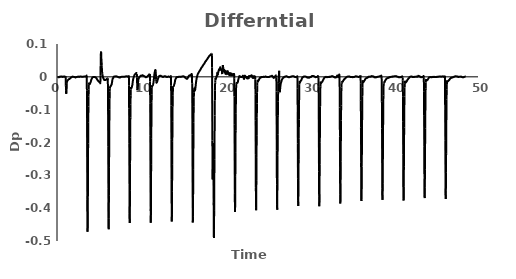
| Category | Series 0 |
|---|---|
| 0.083333 | 0 |
| 0.1 | 0 |
| 0.116667 | 0 |
| 0.133333 | -0.001 |
| 0.15 | -0.001 |
| 0.166667 | -0.001 |
| 0.183333 | -0.001 |
| 0.2 | -0.001 |
| 0.216667 | -0.001 |
| 0.233333 | -0.002 |
| 0.25 | -0.001 |
| 0.266667 | -0.001 |
| 0.283333 | -0.001 |
| 0.3 | 0 |
| 0.316667 | 0 |
| 0.333333 | 0 |
| 0.35 | 0.001 |
| 0.366667 | 0.001 |
| 0.383333 | 0.001 |
| 0.4 | 0.001 |
| 0.416667 | 0.001 |
| 0.433333 | 0 |
| 0.45 | 0 |
| 0.466667 | 0 |
| 0.483333 | 0 |
| 0.5 | 0 |
| 0.516667 | 0.001 |
| 0.533333 | 0.001 |
| 0.55 | 0.001 |
| 0.566667 | 0.001 |
| 0.583333 | 0.001 |
| 0.6 | 0.001 |
| 0.616667 | 0.001 |
| 0.633333 | 0 |
| 0.65 | 0 |
| 0.666667 | 0 |
| 0.683333 | 0 |
| 0.7 | 0 |
| 0.716667 | 0 |
| 0.733333 | 0 |
| 0.75 | 0 |
| 0.766667 | 0 |
| 0.783333 | 0.001 |
| 0.8 | 0.001 |
| 0.816667 | 0.001 |
| 0.833333 | 0 |
| 0.85 | 0 |
| 0.866667 | 0 |
| 0.883333 | 0 |
| 0.9 | 0 |
| 0.916667 | 0.001 |
| 0.933333 | 0.001 |
| 0.95 | 0 |
| 0.966667 | 0 |
| 0.983333 | 0 |
| 1.0 | 0 |
| 1.016667 | 0.002 |
| 1.033333 | -0.001 |
| 1.05 | -0.025 |
| 1.066667 | -0.041 |
| 1.083333 | -0.049 |
| 1.1 | -0.052 |
| 1.116667 | -0.049 |
| 1.133333 | -0.042 |
| 1.15 | -0.032 |
| 1.166667 | -0.021 |
| 1.183333 | -0.017 |
| 1.2 | -0.015 |
| 1.216667 | -0.013 |
| 1.233333 | -0.011 |
| 1.25 | -0.011 |
| 1.266667 | -0.011 |
| 1.283333 | -0.01 |
| 1.3 | -0.01 |
| 1.316667 | -0.009 |
| 1.333333 | -0.009 |
| 1.35 | -0.009 |
| 1.366667 | -0.008 |
| 1.383333 | -0.008 |
| 1.4 | -0.007 |
| 1.416667 | -0.007 |
| 1.433333 | -0.007 |
| 1.45 | -0.007 |
| 1.466667 | -0.007 |
| 1.483333 | -0.006 |
| 1.5 | -0.006 |
| 1.516667 | -0.006 |
| 1.533333 | -0.005 |
| 1.55 | -0.005 |
| 1.566667 | -0.004 |
| 1.583333 | -0.004 |
| 1.6 | -0.004 |
| 1.616667 | -0.003 |
| 1.633333 | -0.003 |
| 1.65 | -0.003 |
| 1.666667 | -0.002 |
| 1.683333 | -0.002 |
| 1.7 | -0.002 |
| 1.716667 | -0.001 |
| 1.733333 | -0.001 |
| 1.75 | -0.001 |
| 1.766667 | -0.001 |
| 1.783333 | -0.001 |
| 1.8 | 0 |
| 1.816667 | 0 |
| 1.833333 | 0 |
| 1.85 | 0.001 |
| 1.866667 | 0.001 |
| 1.883333 | 0.001 |
| 1.9 | 0.001 |
| 1.916667 | 0 |
| 1.933333 | 0 |
| 1.95 | 0 |
| 1.966667 | 0 |
| 1.983333 | 0 |
| 2.0 | 0 |
| 2.016667 | -0.001 |
| 2.033333 | -0.001 |
| 2.05 | -0.001 |
| 2.066667 | -0.001 |
| 2.083333 | -0.001 |
| 2.1 | -0.001 |
| 2.116667 | -0.001 |
| 2.133333 | -0.001 |
| 2.15 | -0.002 |
| 2.166667 | -0.002 |
| 2.183333 | -0.002 |
| 2.2 | -0.002 |
| 2.216667 | -0.002 |
| 2.233333 | -0.001 |
| 2.25 | -0.001 |
| 2.266667 | -0.001 |
| 2.283333 | -0.001 |
| 2.3 | -0.001 |
| 2.316667 | -0.001 |
| 2.333333 | 0 |
| 2.35 | 0 |
| 2.366667 | 0 |
| 2.383333 | 0 |
| 2.4 | 0 |
| 2.416667 | 0 |
| 2.433333 | 0 |
| 2.45 | 0 |
| 2.466667 | 0 |
| 2.483333 | 0.001 |
| 2.5 | 0.001 |
| 2.516667 | 0.001 |
| 2.533333 | 0 |
| 2.55 | 0 |
| 2.566667 | 0 |
| 2.583333 | 0 |
| 2.6 | 0 |
| 2.616667 | 0 |
| 2.633333 | 0 |
| 2.65 | 0 |
| 2.666667 | 0 |
| 2.683333 | 0 |
| 2.7 | 0 |
| 2.716667 | 0.001 |
| 2.733333 | 0.001 |
| 2.75 | 0.001 |
| 2.766667 | 0.001 |
| 2.783333 | 0.001 |
| 2.8 | 0.001 |
| 2.816667 | 0.001 |
| 2.833333 | 0.001 |
| 2.85 | 0.001 |
| 2.866667 | 0.001 |
| 2.883333 | 0.001 |
| 2.9 | 0 |
| 2.916667 | 0 |
| 2.933333 | 0.001 |
| 2.95 | 0 |
| 2.966667 | 0 |
| 2.983333 | 0.001 |
| 3.0 | 0.001 |
| 3.016667 | 0.001 |
| 3.033333 | 0 |
| 3.05 | 0 |
| 3.066667 | 0 |
| 3.083333 | 0 |
| 3.1 | 0 |
| 3.116667 | 0 |
| 3.133333 | 0 |
| 3.15 | 0.001 |
| 3.166667 | 0.001 |
| 3.183333 | 0.001 |
| 3.2 | 0.001 |
| 3.216667 | 0.001 |
| 3.233333 | 0.001 |
| 3.25 | 0.001 |
| 3.266667 | 0.001 |
| 3.283333 | 0.001 |
| 3.3 | 0.001 |
| 3.316667 | 0.001 |
| 3.333333 | 0.001 |
| 3.35 | 0.001 |
| 3.366667 | 0.001 |
| 3.383333 | 0.001 |
| 3.4 | 0.001 |
| 3.416667 | 0.001 |
| 3.433333 | 0.001 |
| 3.45 | 0.001 |
| 3.466667 | 0.001 |
| 3.483333 | 0 |
| 3.5 | 0.001 |
| 3.516667 | 0.004 |
| 3.533333 | 0.003 |
| 3.55 | -0.041 |
| 3.566667 | -0.126 |
| 3.583333 | -0.244 |
| 3.6 | -0.373 |
| 3.616667 | -0.451 |
| 3.633333 | -0.472 |
| 3.65 | -0.433 |
| 3.666667 | -0.366 |
| 3.683333 | -0.283 |
| 3.7 | -0.203 |
| 3.716667 | -0.138 |
| 3.733333 | -0.09 |
| 3.75 | -0.061 |
| 3.766667 | -0.039 |
| 3.783333 | -0.024 |
| 3.8 | -0.018 |
| 3.816667 | -0.018 |
| 3.833333 | -0.02 |
| 3.85 | -0.021 |
| 3.866667 | -0.022 |
| 3.883333 | -0.022 |
| 3.9 | -0.022 |
| 3.916667 | -0.021 |
| 3.933333 | -0.02 |
| 3.95 | -0.019 |
| 3.966667 | -0.018 |
| 3.983333 | -0.017 |
| 4.0 | -0.016 |
| 4.016667 | -0.015 |
| 4.033333 | -0.013 |
| 4.05 | -0.011 |
| 4.066667 | -0.009 |
| 4.083333 | -0.008 |
| 4.1 | -0.007 |
| 4.116667 | -0.007 |
| 4.133333 | -0.006 |
| 4.15 | -0.005 |
| 4.166667 | -0.004 |
| 4.183333 | -0.003 |
| 4.2 | -0.003 |
| 4.216667 | -0.002 |
| 4.233333 | -0.002 |
| 4.25 | -0.001 |
| 4.266667 | -0.001 |
| 4.283333 | -0.001 |
| 4.3 | -0.001 |
| 4.316667 | -0.001 |
| 4.333333 | -0.001 |
| 4.35 | -0.001 |
| 4.366667 | -0.001 |
| 4.383333 | -0.001 |
| 4.4 | 0 |
| 4.416667 | 0 |
| 4.433333 | 0 |
| 4.45 | 0 |
| 4.466667 | 0 |
| 4.483333 | 0 |
| 4.5 | -0.001 |
| 4.516667 | -0.001 |
| 4.533333 | -0.001 |
| 4.55 | -0.001 |
| 4.566667 | -0.002 |
| 4.583333 | -0.002 |
| 4.6 | -0.002 |
| 4.616667 | -0.002 |
| 4.633333 | -0.003 |
| 4.65 | -0.003 |
| 4.666667 | -0.004 |
| 4.683333 | -0.004 |
| 4.7 | -0.005 |
| 4.716667 | -0.006 |
| 4.733333 | -0.006 |
| 4.75 | -0.007 |
| 4.766667 | -0.008 |
| 4.783333 | -0.009 |
| 4.8 | -0.01 |
| 4.816667 | -0.01 |
| 4.833333 | -0.01 |
| 4.85 | -0.011 |
| 4.866667 | -0.011 |
| 4.883333 | -0.012 |
| 4.9 | -0.012 |
| 4.916667 | -0.013 |
| 4.933333 | -0.013 |
| 4.95 | -0.014 |
| 4.966667 | -0.014 |
| 4.983333 | -0.015 |
| 5.0 | -0.015 |
| 5.016667 | -0.016 |
| 5.033333 | -0.016 |
| 5.05 | -0.016 |
| 5.066667 | -0.016 |
| 5.083333 | -0.016 |
| 5.1 | -0.017 |
| 5.116667 | -0.018 |
| 5.133333 | -0.02 |
| 5.15 | -0.017 |
| 5.166667 | 0.005 |
| 5.183333 | 0.035 |
| 5.2 | 0.061 |
| 5.216667 | 0.076 |
| 5.233333 | 0.077 |
| 5.25 | 0.074 |
| 5.266667 | 0.058 |
| 5.283333 | 0.046 |
| 5.3 | 0.044 |
| 5.316667 | 0.034 |
| 5.333333 | 0.025 |
| 5.35 | 0.019 |
| 5.366667 | 0.011 |
| 5.383333 | 0.008 |
| 5.4 | 0.006 |
| 5.416667 | 0.004 |
| 5.433333 | 0.002 |
| 5.45 | 0 |
| 5.466667 | -0.001 |
| 5.483333 | -0.002 |
| 5.5 | -0.004 |
| 5.516667 | -0.005 |
| 5.533333 | -0.006 |
| 5.55 | -0.006 |
| 5.566667 | -0.007 |
| 5.583333 | -0.008 |
| 5.6 | -0.009 |
| 5.616667 | -0.01 |
| 5.633333 | -0.01 |
| 5.65 | -0.01 |
| 5.666667 | -0.01 |
| 5.683333 | -0.01 |
| 5.7 | -0.009 |
| 5.716667 | -0.009 |
| 5.733333 | -0.009 |
| 5.75 | -0.009 |
| 5.766667 | -0.009 |
| 5.783333 | -0.009 |
| 5.8 | -0.009 |
| 5.816667 | -0.009 |
| 5.833333 | -0.008 |
| 5.85 | -0.008 |
| 5.866667 | -0.008 |
| 5.883333 | -0.007 |
| 5.9 | -0.007 |
| 5.916667 | -0.007 |
| 5.933333 | -0.007 |
| 5.95 | -0.006 |
| 5.966667 | -0.005 |
| 5.983333 | -0.005 |
| 6.0 | -0.005 |
| 6.016667 | -0.007 |
| 6.033333 | -0.005 |
| 6.05 | -0.034 |
| 6.066667 | -0.104 |
| 6.083333 | -0.212 |
| 6.1 | -0.339 |
| 6.116667 | -0.431 |
| 6.133333 | -0.464 |
| 6.15 | -0.431 |
| 6.166667 | -0.361 |
| 6.183333 | -0.277 |
| 6.2 | -0.208 |
| 6.216667 | -0.144 |
| 6.233333 | -0.098 |
| 6.25 | -0.067 |
| 6.266667 | -0.044 |
| 6.283333 | -0.036 |
| 6.3 | -0.032 |
| 6.316667 | -0.03 |
| 6.333333 | -0.029 |
| 6.35 | -0.029 |
| 6.366667 | -0.029 |
| 6.383333 | -0.029 |
| 6.4 | -0.028 |
| 6.416667 | -0.026 |
| 6.433333 | -0.025 |
| 6.45 | -0.025 |
| 6.466667 | -0.024 |
| 6.483333 | -0.024 |
| 6.5 | -0.022 |
| 6.516667 | -0.019 |
| 6.533333 | -0.016 |
| 6.55 | -0.014 |
| 6.566667 | -0.011 |
| 6.583333 | -0.009 |
| 6.6 | -0.007 |
| 6.616667 | -0.006 |
| 6.633333 | -0.005 |
| 6.65 | -0.004 |
| 6.666667 | -0.004 |
| 6.683333 | -0.003 |
| 6.7 | -0.002 |
| 6.716667 | -0.001 |
| 6.733333 | 0 |
| 6.75 | 0 |
| 6.766667 | 0.001 |
| 6.783333 | 0.001 |
| 6.8 | 0.001 |
| 6.816667 | 0.001 |
| 6.833333 | 0.001 |
| 6.85 | 0.001 |
| 6.866667 | 0.001 |
| 6.883333 | 0.001 |
| 6.9 | 0.001 |
| 6.916667 | 0.001 |
| 6.933333 | 0.001 |
| 6.95 | 0.001 |
| 6.966667 | 0.001 |
| 6.983333 | 0.002 |
| 7.0 | 0.002 |
| 7.016667 | 0.002 |
| 7.033333 | 0.002 |
| 7.05 | 0.001 |
| 7.066667 | 0.001 |
| 7.083333 | 0.001 |
| 7.1 | 0.001 |
| 7.116667 | 0.001 |
| 7.133333 | 0.001 |
| 7.15 | 0.001 |
| 7.166667 | 0 |
| 7.183333 | 0 |
| 7.2 | 0 |
| 7.216667 | 0 |
| 7.233333 | 0 |
| 7.25 | -0.001 |
| 7.266667 | -0.001 |
| 7.283333 | -0.001 |
| 7.3 | -0.001 |
| 7.316667 | -0.001 |
| 7.333333 | -0.001 |
| 7.35 | -0.001 |
| 7.366667 | -0.002 |
| 7.383333 | -0.002 |
| 7.4 | -0.002 |
| 7.416667 | -0.002 |
| 7.433333 | -0.002 |
| 7.45 | -0.002 |
| 7.466667 | -0.002 |
| 7.483333 | -0.002 |
| 7.5 | -0.001 |
| 7.516667 | -0.001 |
| 7.533333 | -0.001 |
| 7.55 | -0.001 |
| 7.566667 | -0.001 |
| 7.583333 | 0 |
| 7.6 | 0 |
| 7.616667 | 0 |
| 7.633333 | 0 |
| 7.65 | 0 |
| 7.666667 | 0 |
| 7.683333 | 0 |
| 7.7 | 0 |
| 7.716667 | 0.001 |
| 7.733333 | 0.001 |
| 7.75 | 0 |
| 7.766667 | 0.001 |
| 7.783333 | 0.001 |
| 7.8 | 0.001 |
| 7.816667 | 0 |
| 7.833333 | 0 |
| 7.85 | 0 |
| 7.866667 | 0 |
| 7.883333 | 0 |
| 7.9 | 0 |
| 7.916667 | 0 |
| 7.933333 | 0 |
| 7.95 | 0 |
| 7.966667 | 0 |
| 7.983333 | 0 |
| 8.0 | 0 |
| 8.016667 | 0 |
| 8.033333 | 0 |
| 8.05 | 0 |
| 8.066667 | 0 |
| 8.083333 | 0.001 |
| 8.1 | 0.001 |
| 8.116667 | 0.001 |
| 8.133333 | 0.001 |
| 8.15 | 0.001 |
| 8.166667 | 0.001 |
| 8.183333 | 0.001 |
| 8.2 | 0.001 |
| 8.216667 | 0.001 |
| 8.233333 | 0.002 |
| 8.25 | 0.001 |
| 8.266667 | 0.001 |
| 8.283333 | 0.001 |
| 8.3 | 0.001 |
| 8.316667 | 0.001 |
| 8.333333 | 0.001 |
| 8.35 | 0.001 |
| 8.366667 | 0.001 |
| 8.383333 | 0.001 |
| 8.4 | 0.001 |
| 8.416667 | 0 |
| 8.433333 | 0 |
| 8.45 | 0 |
| 8.466667 | 0 |
| 8.483333 | 0 |
| 8.5 | 0.002 |
| 8.516667 | 0.003 |
| 8.533333 | 0.004 |
| 8.55 | -0.026 |
| 8.566667 | -0.096 |
| 8.583333 | -0.203 |
| 8.6 | -0.327 |
| 8.616667 | -0.416 |
| 8.633333 | -0.445 |
| 8.65 | -0.417 |
| 8.666667 | -0.347 |
| 8.683333 | -0.263 |
| 8.7 | -0.185 |
| 8.716667 | -0.124 |
| 8.733333 | -0.085 |
| 8.75 | -0.056 |
| 8.766667 | -0.039 |
| 8.783333 | -0.031 |
| 8.8 | -0.031 |
| 8.816667 | -0.032 |
| 8.833333 | -0.034 |
| 8.85 | -0.034 |
| 8.866667 | -0.033 |
| 8.883333 | -0.032 |
| 8.9 | -0.03 |
| 8.916667 | -0.027 |
| 8.933333 | -0.026 |
| 8.95 | -0.025 |
| 8.966667 | -0.022 |
| 8.983333 | -0.018 |
| 9.0 | -0.014 |
| 9.016667 | -0.011 |
| 9.033333 | -0.009 |
| 9.05 | -0.007 |
| 9.066667 | -0.005 |
| 9.083333 | -0.004 |
| 9.1 | -0.002 |
| 9.116667 | 0 |
| 9.133333 | 0.001 |
| 9.15 | 0.002 |
| 9.166667 | 0.003 |
| 9.183333 | 0.004 |
| 9.2 | 0.005 |
| 9.216667 | 0.006 |
| 9.233333 | 0.007 |
| 9.25 | 0.008 |
| 9.266667 | 0.008 |
| 9.283333 | 0.009 |
| 9.3 | 0.009 |
| 9.316667 | 0.009 |
| 9.333333 | 0.009 |
| 9.35 | 0.009 |
| 9.366667 | 0.01 |
| 9.383333 | 0.011 |
| 9.4 | 0.011 |
| 9.416667 | 0.012 |
| 9.433333 | 0.012 |
| 9.45 | 0.011 |
| 9.466667 | 0.01 |
| 9.483333 | 0.009 |
| 9.5 | -0.002 |
| 9.516667 | -0.02 |
| 9.533333 | -0.034 |
| 9.55 | -0.041 |
| 9.566667 | -0.039 |
| 9.583333 | -0.035 |
| 9.6 | -0.032 |
| 9.616667 | -0.025 |
| 9.633333 | -0.017 |
| 9.65 | -0.012 |
| 9.666667 | -0.008 |
| 9.683333 | -0.006 |
| 9.7 | -0.006 |
| 9.716667 | -0.005 |
| 9.733333 | -0.003 |
| 9.75 | -0.002 |
| 9.766667 | -0.002 |
| 9.783333 | -0.001 |
| 9.8 | 0 |
| 9.816667 | 0 |
| 9.833333 | 0.001 |
| 9.85 | 0.001 |
| 9.866667 | 0.001 |
| 9.883333 | 0.002 |
| 9.9 | 0.002 |
| 9.916667 | 0.002 |
| 9.933333 | 0.003 |
| 9.95 | 0.003 |
| 9.966667 | 0.004 |
| 9.983333 | 0.004 |
| 10.0 | 0.004 |
| 10.016667 | 0.004 |
| 10.033333 | 0.003 |
| 10.05 | 0.003 |
| 10.066667 | 0.003 |
| 10.083333 | 0.004 |
| 10.1 | 0.004 |
| 10.116667 | 0.004 |
| 10.133333 | 0.005 |
| 10.15 | 0.005 |
| 10.166667 | 0.005 |
| 10.183333 | 0.004 |
| 10.2 | 0.004 |
| 10.216667 | 0.004 |
| 10.233333 | 0.004 |
| 10.25 | 0.004 |
| 10.266667 | 0.003 |
| 10.283333 | 0.003 |
| 10.3 | 0.003 |
| 10.316667 | 0.003 |
| 10.333333 | 0.002 |
| 10.35 | 0.002 |
| 10.366667 | 0.002 |
| 10.383333 | 0.002 |
| 10.4 | 0.002 |
| 10.416667 | 0.001 |
| 10.433333 | 0.001 |
| 10.45 | 0.001 |
| 10.466667 | 0 |
| 10.483333 | 0 |
| 10.5 | 0 |
| 10.516667 | -0.001 |
| 10.533333 | -0.001 |
| 10.55 | -0.001 |
| 10.566667 | -0.001 |
| 10.583333 | -0.001 |
| 10.6 | -0.001 |
| 10.616667 | -0.001 |
| 10.633333 | 0 |
| 10.65 | 0 |
| 10.666667 | 0 |
| 10.683333 | 0 |
| 10.7 | 0 |
| 10.716667 | 0 |
| 10.733333 | 0.001 |
| 10.75 | 0.001 |
| 10.766667 | 0.002 |
| 10.783333 | 0.002 |
| 10.8 | 0.003 |
| 10.816667 | 0.004 |
| 10.833333 | 0.004 |
| 10.85 | 0.004 |
| 10.866667 | 0.005 |
| 10.883333 | 0.005 |
| 10.9 | 0.005 |
| 10.916667 | 0.006 |
| 10.933333 | 0.006 |
| 10.95 | 0.007 |
| 10.966667 | 0.007 |
| 10.983333 | 0.007 |
| 11.0 | 0.007 |
| 11.016667 | 0.008 |
| 11.033333 | 0.008 |
| 11.05 | -0.014 |
| 11.066667 | -0.08 |
| 11.083333 | -0.178 |
| 11.1 | -0.301 |
| 11.116667 | -0.401 |
| 11.133333 | -0.444 |
| 11.15 | -0.421 |
| 11.166667 | -0.354 |
| 11.183333 | -0.267 |
| 11.2 | -0.188 |
| 11.216667 | -0.122 |
| 11.233333 | -0.079 |
| 11.25 | -0.053 |
| 11.266667 | -0.033 |
| 11.283333 | -0.027 |
| 11.3 | -0.026 |
| 11.316667 | -0.027 |
| 11.333333 | -0.027 |
| 11.35 | -0.027 |
| 11.366667 | -0.027 |
| 11.383333 | -0.025 |
| 11.4 | -0.024 |
| 11.416667 | -0.022 |
| 11.433333 | -0.02 |
| 11.45 | -0.018 |
| 11.466667 | -0.016 |
| 11.483333 | -0.012 |
| 11.5 | -0.008 |
| 11.516667 | -0.004 |
| 11.533333 | 0 |
| 11.55 | 0.004 |
| 11.566667 | 0.008 |
| 11.583333 | 0.011 |
| 11.6 | 0.014 |
| 11.616667 | 0.015 |
| 11.633333 | 0.017 |
| 11.65 | 0.019 |
| 11.666667 | 0.021 |
| 11.683333 | 0.021 |
| 11.7 | 0.02 |
| 11.716667 | 0.019 |
| 11.733333 | 0.015 |
| 11.75 | 0.002 |
| 11.766667 | -0.009 |
| 11.783333 | -0.014 |
| 11.8 | -0.017 |
| 11.816667 | -0.018 |
| 11.833333 | -0.018 |
| 11.85 | -0.017 |
| 11.866667 | -0.016 |
| 11.883333 | -0.016 |
| 11.9 | -0.015 |
| 11.916667 | -0.013 |
| 11.933333 | -0.011 |
| 11.95 | -0.01 |
| 11.966667 | -0.008 |
| 11.983333 | -0.007 |
| 12.0 | -0.006 |
| 12.016667 | -0.004 |
| 12.033333 | -0.003 |
| 12.05 | -0.002 |
| 12.066667 | -0.001 |
| 12.083333 | 0 |
| 12.1 | 0.001 |
| 12.116667 | 0.002 |
| 12.133333 | 0.002 |
| 12.15 | 0.002 |
| 12.166667 | 0.002 |
| 12.183333 | 0.002 |
| 12.2 | 0.003 |
| 12.216667 | 0.003 |
| 12.233333 | 0.003 |
| 12.25 | 0.003 |
| 12.266667 | 0.003 |
| 12.283333 | 0.003 |
| 12.3 | 0.003 |
| 12.316667 | 0.003 |
| 12.333333 | 0.003 |
| 12.35 | 0.003 |
| 12.366667 | 0.002 |
| 12.383333 | 0.002 |
| 12.4 | 0.002 |
| 12.416667 | 0.002 |
| 12.433333 | 0.001 |
| 12.45 | 0.001 |
| 12.466667 | 0.001 |
| 12.483333 | 0.001 |
| 12.5 | 0.001 |
| 12.516667 | 0.001 |
| 12.533333 | 0.001 |
| 12.55 | 0 |
| 12.566667 | 0 |
| 12.583333 | 0 |
| 12.6 | -0.001 |
| 12.616667 | 0 |
| 12.633333 | 0 |
| 12.65 | 0.001 |
| 12.666667 | 0.001 |
| 12.683333 | 0.001 |
| 12.7 | 0.001 |
| 12.716667 | 0.001 |
| 12.733333 | 0.001 |
| 12.75 | 0.002 |
| 12.766667 | 0.002 |
| 12.783333 | 0.002 |
| 12.8 | 0.001 |
| 12.816667 | 0.001 |
| 12.833333 | 0.002 |
| 12.85 | 0.002 |
| 12.866667 | 0.002 |
| 12.883333 | 0.001 |
| 12.9 | 0.001 |
| 12.916667 | 0.001 |
| 12.933333 | 0 |
| 12.95 | 0 |
| 12.966667 | 0 |
| 12.983333 | 0 |
| 13.0 | 0 |
| 13.016667 | 0 |
| 13.033333 | 0 |
| 13.05 | -0.001 |
| 13.066667 | -0.001 |
| 13.083333 | -0.001 |
| 13.1 | 0 |
| 13.116667 | 0 |
| 13.133333 | 0 |
| 13.15 | 0 |
| 13.166667 | 0.001 |
| 13.183333 | 0.001 |
| 13.2 | 0.001 |
| 13.216667 | 0.001 |
| 13.233333 | 0.001 |
| 13.25 | 0.001 |
| 13.266667 | 0.001 |
| 13.283333 | 0 |
| 13.3 | 0 |
| 13.316667 | 0 |
| 13.333333 | 0 |
| 13.35 | 0 |
| 13.366667 | 0 |
| 13.383333 | 0 |
| 13.4 | 0 |
| 13.416667 | -0.001 |
| 13.433333 | -0.001 |
| 13.45 | -0.001 |
| 13.466667 | -0.002 |
| 13.483333 | -0.001 |
| 13.5 | 0 |
| 13.516667 | 0.002 |
| 13.533333 | 0.001 |
| 13.55 | -0.027 |
| 13.566667 | -0.087 |
| 13.583333 | -0.191 |
| 13.6 | -0.314 |
| 13.616667 | -0.403 |
| 13.633333 | -0.441 |
| 13.65 | -0.418 |
| 13.666667 | -0.349 |
| 13.683333 | -0.268 |
| 13.7 | -0.196 |
| 13.716667 | -0.136 |
| 13.733333 | -0.09 |
| 13.75 | -0.057 |
| 13.766667 | -0.04 |
| 13.783333 | -0.031 |
| 13.8 | -0.028 |
| 13.816667 | -0.028 |
| 13.833333 | -0.028 |
| 13.85 | -0.028 |
| 13.866667 | -0.028 |
| 13.883333 | -0.027 |
| 13.9 | -0.026 |
| 13.916667 | -0.023 |
| 13.933333 | -0.022 |
| 13.95 | -0.022 |
| 13.966667 | -0.02 |
| 13.983333 | -0.018 |
| 14.0 | -0.015 |
| 14.016667 | -0.013 |
| 14.033333 | -0.01 |
| 14.05 | -0.009 |
| 14.066667 | -0.007 |
| 14.083333 | -0.006 |
| 14.1 | -0.006 |
| 14.116667 | -0.005 |
| 14.133333 | -0.004 |
| 14.15 | -0.003 |
| 14.166667 | -0.002 |
| 14.183333 | -0.002 |
| 14.2 | -0.001 |
| 14.216667 | -0.001 |
| 14.233333 | -0.001 |
| 14.25 | -0.001 |
| 14.266667 | -0.001 |
| 14.283333 | -0.001 |
| 14.3 | -0.001 |
| 14.316667 | -0.001 |
| 14.333333 | -0.001 |
| 14.35 | -0.001 |
| 14.366667 | 0 |
| 14.383333 | 0 |
| 14.4 | 0 |
| 14.416667 | 0 |
| 14.433333 | 0 |
| 14.45 | 0 |
| 14.466667 | 0 |
| 14.483333 | 0 |
| 14.5 | 0 |
| 14.516667 | 0 |
| 14.533333 | 0 |
| 14.55 | 0 |
| 14.566667 | 0 |
| 14.583333 | 0 |
| 14.6 | 0 |
| 14.616667 | 0 |
| 14.633333 | 0 |
| 14.65 | 0 |
| 14.666667 | 0 |
| 14.683333 | 0 |
| 14.7 | 0 |
| 14.716667 | 0 |
| 14.733333 | 0 |
| 14.75 | 0 |
| 14.766667 | 0 |
| 14.783333 | 0 |
| 14.8 | 0 |
| 14.816667 | 0.001 |
| 14.833333 | 0.001 |
| 14.85 | 0.001 |
| 14.866667 | 0.001 |
| 14.883333 | 0.001 |
| 14.9 | 0.001 |
| 14.916667 | 0.001 |
| 14.933333 | 0.001 |
| 14.95 | 0.001 |
| 14.966667 | 0.001 |
| 14.983333 | 0.002 |
| 15.0 | 0.002 |
| 15.016667 | 0.001 |
| 15.033333 | 0.001 |
| 15.05 | 0.001 |
| 15.066667 | 0.001 |
| 15.083333 | 0.001 |
| 15.1 | 0.001 |
| 15.116667 | 0 |
| 15.133333 | 0 |
| 15.15 | 0 |
| 15.166667 | -0.001 |
| 15.183333 | -0.001 |
| 15.2 | -0.002 |
| 15.216667 | -0.002 |
| 15.233333 | -0.003 |
| 15.25 | -0.003 |
| 15.266667 | -0.003 |
| 15.283333 | -0.004 |
| 15.3 | -0.004 |
| 15.316667 | -0.004 |
| 15.333333 | -0.005 |
| 15.35 | -0.005 |
| 15.366667 | -0.005 |
| 15.383333 | -0.006 |
| 15.4 | -0.006 |
| 15.416667 | -0.006 |
| 15.433333 | -0.006 |
| 15.45 | -0.006 |
| 15.466667 | -0.006 |
| 15.483333 | -0.006 |
| 15.5 | -0.005 |
| 15.516667 | -0.004 |
| 15.533333 | -0.003 |
| 15.55 | -0.002 |
| 15.566667 | -0.001 |
| 15.583333 | -0.001 |
| 15.6 | 0 |
| 15.616667 | 0.001 |
| 15.633333 | 0.002 |
| 15.65 | 0.003 |
| 15.666667 | 0.003 |
| 15.683333 | 0.004 |
| 15.7 | 0.004 |
| 15.716667 | 0.004 |
| 15.733333 | 0.004 |
| 15.75 | 0.004 |
| 15.766667 | 0.005 |
| 15.783333 | 0.005 |
| 15.8 | 0.005 |
| 15.816667 | 0.005 |
| 15.833333 | 0.005 |
| 15.85 | 0.005 |
| 15.866667 | 0.005 |
| 15.883333 | 0.005 |
| 15.9 | 0.005 |
| 15.916667 | 0.006 |
| 15.933333 | 0.006 |
| 15.95 | 0.008 |
| 15.966667 | 0.009 |
| 15.983333 | 0.009 |
| 16.0 | 0.008 |
| 16.016667 | 0.005 |
| 16.033333 | 0.006 |
| 16.05 | -0.021 |
| 16.066667 | -0.079 |
| 16.083333 | -0.176 |
| 16.1 | -0.296 |
| 16.116667 | -0.399 |
| 16.133333 | -0.444 |
| 16.15 | -0.425 |
| 16.166667 | -0.362 |
| 16.183333 | -0.282 |
| 16.2 | -0.204 |
| 16.216667 | -0.139 |
| 16.233333 | -0.09 |
| 16.25 | -0.064 |
| 16.266667 | -0.047 |
| 16.283333 | -0.039 |
| 16.3 | -0.035 |
| 16.316667 | -0.036 |
| 16.333333 | -0.039 |
| 16.35 | -0.04 |
| 16.366667 | -0.04 |
| 16.383333 | -0.042 |
| 16.4 | -0.04 |
| 16.416667 | -0.038 |
| 16.433333 | -0.035 |
| 16.45 | -0.031 |
| 16.466667 | -0.028 |
| 16.483333 | -0.024 |
| 16.5 | -0.019 |
| 16.516667 | -0.016 |
| 16.533333 | -0.013 |
| 16.55 | -0.01 |
| 16.566667 | -0.007 |
| 16.583333 | -0.005 |
| 16.6 | -0.003 |
| 16.616667 | -0.001 |
| 16.633333 | 0.001 |
| 16.65 | 0.002 |
| 16.666667 | 0.004 |
| 16.683333 | 0.005 |
| 16.7 | 0.007 |
| 16.716667 | 0.008 |
| 16.733333 | 0.009 |
| 16.75 | 0.01 |
| 16.766667 | 0.011 |
| 16.783333 | 0.011 |
| 16.8 | 0.012 |
| 16.816667 | 0.013 |
| 16.833333 | 0.014 |
| 16.85 | 0.014 |
| 16.866667 | 0.015 |
| 16.883333 | 0.016 |
| 16.9 | 0.017 |
| 16.916667 | 0.017 |
| 16.933333 | 0.018 |
| 16.95 | 0.019 |
| 16.966667 | 0.019 |
| 16.983333 | 0.02 |
| 17.0 | 0.021 |
| 17.016667 | 0.021 |
| 17.033333 | 0.022 |
| 17.05 | 0.023 |
| 17.066667 | 0.023 |
| 17.083333 | 0.024 |
| 17.1 | 0.025 |
| 17.116667 | 0.026 |
| 17.133333 | 0.027 |
| 17.15 | 0.028 |
| 17.166667 | 0.028 |
| 17.183333 | 0.029 |
| 17.2 | 0.029 |
| 17.216667 | 0.03 |
| 17.233333 | 0.03 |
| 17.25 | 0.031 |
| 17.266667 | 0.032 |
| 17.283333 | 0.032 |
| 17.3 | 0.033 |
| 17.316667 | 0.034 |
| 17.333333 | 0.034 |
| 17.35 | 0.035 |
| 17.366667 | 0.036 |
| 17.383333 | 0.037 |
| 17.4 | 0.037 |
| 17.416667 | 0.038 |
| 17.433333 | 0.038 |
| 17.45 | 0.039 |
| 17.466667 | 0.039 |
| 17.483333 | 0.04 |
| 17.5 | 0.041 |
| 17.516667 | 0.042 |
| 17.533333 | 0.042 |
| 17.55 | 0.043 |
| 17.566667 | 0.044 |
| 17.583333 | 0.045 |
| 17.6 | 0.045 |
| 17.616667 | 0.046 |
| 17.633333 | 0.047 |
| 17.65 | 0.047 |
| 17.666667 | 0.048 |
| 17.683333 | 0.048 |
| 17.7 | 0.049 |
| 17.716667 | 0.049 |
| 17.733333 | 0.05 |
| 17.75 | 0.051 |
| 17.766667 | 0.051 |
| 17.783333 | 0.052 |
| 17.8 | 0.052 |
| 17.816667 | 0.053 |
| 17.833333 | 0.053 |
| 17.85 | 0.054 |
| 17.866667 | 0.055 |
| 17.883333 | 0.056 |
| 17.9 | 0.057 |
| 17.916667 | 0.057 |
| 17.933333 | 0.058 |
| 17.95 | 0.058 |
| 17.966667 | 0.059 |
| 17.983333 | 0.059 |
| 18.0 | 0.06 |
| 18.016667 | 0.061 |
| 18.033333 | 0.062 |
| 18.05 | 0.062 |
| 18.066667 | 0.063 |
| 18.083333 | 0.064 |
| 18.1 | 0.064 |
| 18.116667 | 0.064 |
| 18.133333 | 0.065 |
| 18.15 | 0.065 |
| 18.166667 | 0.065 |
| 18.183333 | 0.066 |
| 18.2 | 0.066 |
| 18.216667 | 0.067 |
| 18.233333 | 0.067 |
| 18.25 | 0.068 |
| 18.266667 | 0.068 |
| 18.283333 | 0.068 |
| 18.3 | 0.068 |
| 18.316667 | 0.069 |
| 18.333333 | 0.07 |
| 18.35 | 0.07 |
| 18.366667 | 0.069 |
| 18.383333 | 0.071 |
| 18.4 | 0.064 |
| 18.416667 | 0.029 |
| 18.433333 | -0.071 |
| 18.45 | -0.194 |
| 18.466667 | -0.282 |
| 18.483333 | -0.313 |
| 18.5 | -0.304 |
| 18.516667 | -0.273 |
| 18.533333 | -0.228 |
| 18.55 | -0.202 |
| 18.566667 | -0.223 |
| 18.583333 | -0.288 |
| 18.6 | -0.382 |
| 18.616667 | -0.461 |
| 18.633333 | -0.491 |
| 18.65 | -0.464 |
| 18.666667 | -0.407 |
| 18.683333 | -0.329 |
| 18.7 | -0.252 |
| 18.716667 | -0.18 |
| 18.733333 | -0.118 |
| 18.75 | -0.073 |
| 18.766667 | -0.041 |
| 18.783333 | -0.017 |
| 18.8 | -0.011 |
| 18.816667 | -0.007 |
| 18.833333 | -0.004 |
| 18.85 | -0.006 |
| 18.866667 | -0.005 |
| 18.883333 | -0.006 |
| 18.9 | -0.004 |
| 18.916667 | 0.001 |
| 18.933333 | 0.001 |
| 18.95 | 0.001 |
| 18.966667 | 0 |
| 18.983333 | 0.002 |
| 19.0 | 0.003 |
| 19.016667 | 0.006 |
| 19.033333 | 0.011 |
| 19.05 | 0.013 |
| 19.066667 | 0.013 |
| 19.083333 | 0.008 |
| 19.1 | 0.007 |
| 19.116667 | 0.008 |
| 19.133333 | 0.012 |
| 19.15 | 0.013 |
| 19.166667 | 0.017 |
| 19.183333 | 0.018 |
| 19.2 | 0.018 |
| 19.216667 | 0.019 |
| 19.233333 | 0.023 |
| 19.25 | 0.021 |
| 19.266667 | 0.02 |
| 19.283333 | 0.021 |
| 19.3 | 0.021 |
| 19.316667 | 0.02 |
| 19.333333 | 0.024 |
| 19.35 | 0.028 |
| 19.366667 | 0.026 |
| 19.383333 | 0.029 |
| 19.4 | 0.029 |
| 19.416667 | 0.025 |
| 19.433333 | 0.025 |
| 19.45 | 0.026 |
| 19.466667 | 0.024 |
| 19.483333 | 0.02 |
| 19.5 | 0.023 |
| 19.516667 | 0.021 |
| 19.533333 | 0.02 |
| 19.55 | 0.02 |
| 19.566667 | 0.02 |
| 19.583333 | 0.017 |
| 19.6 | 0.012 |
| 19.616667 | 0.009 |
| 19.633333 | 0.008 |
| 19.65 | 0.018 |
| 19.666667 | 0.023 |
| 19.683333 | 0.03 |
| 19.7 | 0.036 |
| 19.716667 | 0.033 |
| 19.733333 | 0.029 |
| 19.75 | 0.02 |
| 19.766667 | 0.016 |
| 19.783333 | 0.018 |
| 19.8 | 0.018 |
| 19.816667 | 0.019 |
| 19.833333 | 0.024 |
| 19.85 | 0.023 |
| 19.866667 | 0.019 |
| 19.883333 | 0.014 |
| 19.9 | 0.013 |
| 19.916667 | 0.015 |
| 19.933333 | 0.018 |
| 19.95 | 0.015 |
| 19.966667 | 0.017 |
| 19.983333 | 0.018 |
| 20.0 | 0.015 |
| 20.016667 | 0.016 |
| 20.033333 | 0.007 |
| 20.05 | 0.007 |
| 20.066667 | 0.013 |
| 20.083333 | 0.015 |
| 20.1 | 0.012 |
| 20.116667 | 0.007 |
| 20.133333 | 0.009 |
| 20.15 | 0.014 |
| 20.166667 | 0.01 |
| 20.183333 | 0.011 |
| 20.2 | 0.016 |
| 20.216667 | 0.016 |
| 20.233333 | 0.016 |
| 20.25 | 0.019 |
| 20.266667 | 0.019 |
| 20.283333 | 0.015 |
| 20.3 | 0.011 |
| 20.316667 | 0.007 |
| 20.333333 | 0.01 |
| 20.35 | 0.011 |
| 20.366667 | 0.007 |
| 20.383333 | 0.009 |
| 20.4 | 0.012 |
| 20.416667 | 0.011 |
| 20.433333 | 0.01 |
| 20.45 | 0.009 |
| 20.466667 | 0.008 |
| 20.483333 | 0.003 |
| 20.5 | 0.003 |
| 20.516667 | 0.006 |
| 20.533333 | 0.005 |
| 20.55 | 0.01 |
| 20.566667 | 0.013 |
| 20.583333 | 0.01 |
| 20.6 | 0.01 |
| 20.616667 | 0.009 |
| 20.633333 | 0.005 |
| 20.65 | 0.009 |
| 20.666667 | 0.007 |
| 20.683333 | 0.004 |
| 20.7 | 0.006 |
| 20.716667 | 0.009 |
| 20.733333 | 0.01 |
| 20.75 | 0.007 |
| 20.766667 | 0.008 |
| 20.783333 | 0.007 |
| 20.8 | 0.008 |
| 20.816667 | 0.006 |
| 20.833333 | 0.005 |
| 20.85 | 0.006 |
| 20.866667 | 0.008 |
| 20.883333 | 0.007 |
| 20.9 | 0.006 |
| 20.916667 | 0.005 |
| 20.933333 | 0.002 |
| 20.95 | 0.005 |
| 20.966667 | 0.007 |
| 20.983333 | 0.004 |
| 21.0 | 0.008 |
| 21.016667 | 0.01 |
| 21.033333 | 0.011 |
| 21.05 | -0.006 |
| 21.066667 | -0.06 |
| 21.083333 | -0.146 |
| 21.1 | -0.257 |
| 21.116667 | -0.355 |
| 21.133333 | -0.405 |
| 21.15 | -0.411 |
| 21.166667 | -0.369 |
| 21.183333 | -0.303 |
| 21.2 | -0.231 |
| 21.216667 | -0.163 |
| 21.233333 | -0.111 |
| 21.25 | -0.071 |
| 21.266667 | -0.04 |
| 21.283333 | -0.025 |
| 21.3 | -0.021 |
| 21.316667 | -0.019 |
| 21.333333 | -0.019 |
| 21.35 | -0.018 |
| 21.366667 | -0.018 |
| 21.383333 | -0.019 |
| 21.4 | -0.019 |
| 21.416667 | -0.018 |
| 21.433333 | -0.018 |
| 21.45 | -0.017 |
| 21.466667 | -0.016 |
| 21.483333 | -0.015 |
| 21.5 | -0.012 |
| 21.516667 | -0.01 |
| 21.533333 | -0.008 |
| 21.55 | -0.007 |
| 21.566667 | -0.005 |
| 21.583333 | -0.004 |
| 21.6 | -0.002 |
| 21.616667 | -0.001 |
| 21.633333 | 0.001 |
| 21.65 | 0.002 |
| 21.666667 | 0.002 |
| 21.683333 | 0.002 |
| 21.7 | 0.002 |
| 21.716667 | 0.002 |
| 21.733333 | 0.001 |
| 21.75 | 0.001 |
| 21.766667 | 0 |
| 21.783333 | 0 |
| 21.8 | 0 |
| 21.816667 | -0.001 |
| 21.833333 | -0.001 |
| 21.85 | -0.001 |
| 21.866667 | 0 |
| 21.883333 | 0 |
| 21.9 | 0 |
| 21.916667 | 0 |
| 21.933333 | 0 |
| 21.95 | 0 |
| 21.966667 | 0 |
| 21.983333 | -0.001 |
| 22.0 | 0 |
| 22.016667 | 0 |
| 22.033333 | 0.001 |
| 22.05 | 0.002 |
| 22.066667 | 0.003 |
| 22.083333 | 0.003 |
| 22.1 | 0.003 |
| 22.116667 | 0.003 |
| 22.133333 | 0.001 |
| 22.15 | -0.001 |
| 22.166667 | -0.003 |
| 22.183333 | -0.006 |
| 22.2 | -0.005 |
| 22.216667 | -0.007 |
| 22.233333 | -0.006 |
| 22.25 | -0.005 |
| 22.266667 | -0.001 |
| 22.283333 | 0.001 |
| 22.3 | 0.001 |
| 22.316667 | 0.004 |
| 22.333333 | 0.003 |
| 22.35 | 0.001 |
| 22.366667 | -0.003 |
| 22.383333 | 0.003 |
| 22.4 | 0.003 |
| 22.416667 | -0.001 |
| 22.433333 | 0 |
| 22.45 | -0.001 |
| 22.466667 | -0.001 |
| 22.483333 | 0.003 |
| 22.5 | -0.001 |
| 22.516667 | -0.001 |
| 22.533333 | 0.001 |
| 22.55 | -0.003 |
| 22.566667 | -0.006 |
| 22.583333 | -0.003 |
| 22.6 | -0.002 |
| 22.616667 | -0.001 |
| 22.633333 | -0.002 |
| 22.65 | -0.005 |
| 22.666667 | -0.007 |
| 22.683333 | -0.001 |
| 22.7 | 0 |
| 22.716667 | -0.002 |
| 22.733333 | -0.004 |
| 22.75 | -0.006 |
| 22.766667 | -0.002 |
| 22.783333 | 0.001 |
| 22.8 | 0.002 |
| 22.816667 | 0.001 |
| 22.833333 | 0 |
| 22.85 | 0.001 |
| 22.866667 | 0.001 |
| 22.883333 | 0.001 |
| 22.9 | 0.005 |
| 22.916667 | 0.002 |
| 22.933333 | 0.002 |
| 22.95 | 0.003 |
| 22.966667 | 0.003 |
| 22.983333 | 0 |
| 23.0 | 0.004 |
| 23.016667 | 0.003 |
| 23.033333 | 0.002 |
| 23.05 | 0.001 |
| 23.066667 | 0.002 |
| 23.083333 | 0.002 |
| 23.1 | 0.003 |
| 23.116667 | 0.005 |
| 23.133333 | 0.004 |
| 23.15 | 0 |
| 23.166667 | 0.002 |
| 23.183333 | 0.003 |
| 23.2 | -0.002 |
| 23.216667 | -0.001 |
| 23.233333 | -0.003 |
| 23.25 | -0.001 |
| 23.266667 | 0.002 |
| 23.283333 | 0 |
| 23.3 | -0.001 |
| 23.316667 | 0 |
| 23.333333 | -0.003 |
| 23.35 | -0.006 |
| 23.366667 | -0.004 |
| 23.383333 | -0.002 |
| 23.4 | 0.001 |
| 23.416667 | 0.002 |
| 23.433333 | 0 |
| 23.45 | 0.001 |
| 23.466667 | 0 |
| 23.483333 | -0.003 |
| 23.5 | 0 |
| 23.516667 | 0.001 |
| 23.533333 | -0.001 |
| 23.55 | -0.009 |
| 23.566667 | -0.054 |
| 23.583333 | -0.132 |
| 23.6 | -0.236 |
| 23.616667 | -0.337 |
| 23.633333 | -0.397 |
| 23.65 | -0.406 |
| 23.666667 | -0.373 |
| 23.683333 | -0.316 |
| 23.7 | -0.245 |
| 23.716667 | -0.179 |
| 23.733333 | -0.125 |
| 23.75 | -0.081 |
| 23.766667 | -0.048 |
| 23.783333 | -0.025 |
| 23.8 | -0.016 |
| 23.816667 | -0.012 |
| 23.833333 | -0.012 |
| 23.85 | -0.013 |
| 23.866667 | -0.014 |
| 23.883333 | -0.014 |
| 23.9 | -0.013 |
| 23.916667 | -0.011 |
| 23.933333 | -0.011 |
| 23.95 | -0.011 |
| 23.966667 | -0.01 |
| 23.983333 | -0.008 |
| 24.0 | -0.008 |
| 24.016667 | -0.007 |
| 24.033333 | -0.006 |
| 24.05 | -0.005 |
| 24.066667 | -0.004 |
| 24.083333 | -0.004 |
| 24.1 | -0.003 |
| 24.116667 | -0.003 |
| 24.133333 | -0.003 |
| 24.15 | -0.002 |
| 24.166667 | -0.002 |
| 24.183333 | -0.003 |
| 24.2 | -0.003 |
| 24.216667 | -0.002 |
| 24.233333 | -0.002 |
| 24.25 | -0.001 |
| 24.266667 | -0.001 |
| 24.283333 | -0.001 |
| 24.3 | -0.001 |
| 24.316667 | -0.001 |
| 24.333333 | -0.001 |
| 24.35 | -0.001 |
| 24.366667 | -0.001 |
| 24.383333 | -0.001 |
| 24.4 | -0.001 |
| 24.416667 | -0.001 |
| 24.433333 | -0.001 |
| 24.45 | -0.001 |
| 24.466667 | -0.001 |
| 24.483333 | 0 |
| 24.5 | 0 |
| 24.516667 | 0 |
| 24.533333 | 0 |
| 24.55 | 0 |
| 24.566667 | 0 |
| 24.583333 | 0 |
| 24.6 | 0 |
| 24.616667 | 0 |
| 24.633333 | 0 |
| 24.65 | 0 |
| 24.666667 | 0 |
| 24.683333 | 0 |
| 24.7 | 0 |
| 24.716667 | 0 |
| 24.733333 | 0.001 |
| 24.75 | 0.001 |
| 24.766667 | 0.001 |
| 24.783333 | 0.001 |
| 24.8 | 0.001 |
| 24.816667 | 0 |
| 24.833333 | 0 |
| 24.85 | 0 |
| 24.866667 | 0 |
| 24.883333 | 0 |
| 24.9 | 0 |
| 24.916667 | 0 |
| 24.933333 | -0.001 |
| 24.95 | -0.001 |
| 24.966667 | -0.001 |
| 24.983333 | -0.001 |
| 25.0 | -0.001 |
| 25.016667 | -0.001 |
| 25.033333 | -0.001 |
| 25.05 | -0.001 |
| 25.066667 | -0.001 |
| 25.083333 | -0.001 |
| 25.1 | 0 |
| 25.116667 | 0 |
| 25.133333 | 0 |
| 25.15 | 0 |
| 25.166667 | 0 |
| 25.183333 | 0 |
| 25.2 | 0 |
| 25.216667 | 0 |
| 25.233333 | 0 |
| 25.25 | 0 |
| 25.266667 | 0.001 |
| 25.283333 | 0.001 |
| 25.3 | 0.001 |
| 25.316667 | 0.001 |
| 25.333333 | 0.001 |
| 25.35 | 0.002 |
| 25.366667 | 0.002 |
| 25.383333 | 0.001 |
| 25.4 | 0.001 |
| 25.416667 | 0.001 |
| 25.433333 | 0.002 |
| 25.45 | 0.002 |
| 25.466667 | 0.002 |
| 25.483333 | 0.002 |
| 25.5 | 0.003 |
| 25.516667 | 0.003 |
| 25.533333 | 0.003 |
| 25.55 | 0.003 |
| 25.566667 | 0.003 |
| 25.583333 | 0.002 |
| 25.6 | 0.001 |
| 25.616667 | 0.001 |
| 25.633333 | 0.001 |
| 25.65 | 0 |
| 25.666667 | 0 |
| 25.683333 | -0.001 |
| 25.7 | -0.002 |
| 25.716667 | -0.003 |
| 25.733333 | -0.003 |
| 25.75 | -0.003 |
| 25.766667 | -0.003 |
| 25.783333 | -0.003 |
| 25.8 | -0.002 |
| 25.816667 | -0.001 |
| 25.833333 | -0.001 |
| 25.85 | -0.001 |
| 25.866667 | -0.001 |
| 25.883333 | 0 |
| 25.9 | 0.001 |
| 25.916667 | 0.002 |
| 25.933333 | 0.002 |
| 25.95 | 0.003 |
| 25.966667 | 0.004 |
| 25.983333 | 0.004 |
| 26.0 | 0.004 |
| 26.016667 | 0.004 |
| 26.033333 | 0.003 |
| 26.05 | -0.003 |
| 26.066667 | -0.045 |
| 26.083333 | -0.12 |
| 26.1 | -0.225 |
| 26.116667 | -0.328 |
| 26.133333 | -0.39 |
| 26.15 | -0.405 |
| 26.166667 | -0.372 |
| 26.183333 | -0.311 |
| 26.2 | -0.239 |
| 26.216667 | -0.176 |
| 26.233333 | -0.118 |
| 26.25 | -0.076 |
| 26.266667 | -0.044 |
| 26.283333 | -0.021 |
| 26.3 | -0.01 |
| 26.316667 | -0.005 |
| 26.333333 | -0.001 |
| 26.35 | 0.005 |
| 26.366667 | 0.011 |
| 26.383333 | 0.018 |
| 26.4 | 0.006 |
| 26.416667 | -0.018 |
| 26.433333 | -0.037 |
| 26.45 | -0.047 |
| 26.466667 | -0.046 |
| 26.483333 | -0.041 |
| 26.5 | -0.037 |
| 26.516667 | -0.033 |
| 26.533333 | -0.028 |
| 26.55 | -0.025 |
| 26.566667 | -0.022 |
| 26.583333 | -0.02 |
| 26.6 | -0.018 |
| 26.616667 | -0.017 |
| 26.633333 | -0.016 |
| 26.65 | -0.014 |
| 26.666667 | -0.012 |
| 26.683333 | -0.011 |
| 26.7 | -0.01 |
| 26.716667 | -0.009 |
| 26.733333 | -0.008 |
| 26.75 | -0.007 |
| 26.766667 | -0.006 |
| 26.783333 | -0.006 |
| 26.8 | -0.005 |
| 26.816667 | -0.005 |
| 26.833333 | -0.004 |
| 26.85 | -0.003 |
| 26.866667 | -0.003 |
| 26.883333 | -0.003 |
| 26.9 | -0.002 |
| 26.916667 | -0.002 |
| 26.933333 | -0.001 |
| 26.95 | -0.001 |
| 26.966667 | -0.001 |
| 26.983333 | 0 |
| 27.0 | 0 |
| 27.016667 | 0 |
| 27.033333 | 0 |
| 27.05 | 0 |
| 27.066667 | 0 |
| 27.083333 | 0 |
| 27.1 | 0.001 |
| 27.116667 | 0.001 |
| 27.133333 | 0.001 |
| 27.15 | 0.001 |
| 27.166667 | 0.001 |
| 27.183333 | 0.001 |
| 27.2 | 0.002 |
| 27.216667 | 0.002 |
| 27.233333 | 0.002 |
| 27.25 | 0.002 |
| 27.266667 | 0.002 |
| 27.283333 | 0.001 |
| 27.3 | 0.001 |
| 27.316667 | 0.001 |
| 27.333333 | 0.001 |
| 27.35 | 0.001 |
| 27.366667 | 0 |
| 27.383333 | 0 |
| 27.4 | 0 |
| 27.416667 | 0 |
| 27.433333 | 0 |
| 27.45 | -0.001 |
| 27.466667 | -0.001 |
| 27.483333 | -0.001 |
| 27.5 | -0.001 |
| 27.516667 | -0.001 |
| 27.533333 | -0.001 |
| 27.55 | -0.001 |
| 27.566667 | -0.001 |
| 27.583333 | -0.001 |
| 27.6 | -0.001 |
| 27.616667 | -0.001 |
| 27.633333 | -0.001 |
| 27.65 | -0.001 |
| 27.666667 | -0.001 |
| 27.683333 | 0 |
| 27.7 | 0 |
| 27.716667 | 0 |
| 27.733333 | 0 |
| 27.75 | 0 |
| 27.766667 | 0 |
| 27.783333 | 0 |
| 27.8 | 0 |
| 27.816667 | 0.001 |
| 27.833333 | 0.001 |
| 27.85 | 0.001 |
| 27.866667 | 0.001 |
| 27.883333 | 0.001 |
| 27.9 | 0.001 |
| 27.916667 | 0.002 |
| 27.933333 | 0.001 |
| 27.95 | 0.001 |
| 27.966667 | 0.002 |
| 27.983333 | 0.002 |
| 28.0 | 0.002 |
| 28.016667 | 0.002 |
| 28.033333 | 0.002 |
| 28.05 | 0.002 |
| 28.066667 | 0.002 |
| 28.083333 | 0.002 |
| 28.1 | 0.002 |
| 28.116667 | 0.002 |
| 28.133333 | 0.001 |
| 28.15 | 0.001 |
| 28.166667 | 0.001 |
| 28.183333 | 0 |
| 28.2 | 0 |
| 28.216667 | 0 |
| 28.233333 | 0 |
| 28.25 | 0 |
| 28.266667 | 0 |
| 28.283333 | 0 |
| 28.3 | 0 |
| 28.316667 | -0.001 |
| 28.333333 | -0.001 |
| 28.35 | -0.001 |
| 28.366667 | -0.001 |
| 28.383333 | -0.001 |
| 28.4 | -0.001 |
| 28.416667 | -0.001 |
| 28.433333 | -0.001 |
| 28.45 | -0.001 |
| 28.466667 | -0.001 |
| 28.483333 | -0.001 |
| 28.5 | 0 |
| 28.516667 | 0.001 |
| 28.533333 | 0.002 |
| 28.55 | -0.001 |
| 28.566667 | -0.037 |
| 28.583333 | -0.107 |
| 28.6 | -0.203 |
| 28.616667 | -0.31 |
| 28.633333 | -0.376 |
| 28.65 | -0.393 |
| 28.666667 | -0.367 |
| 28.683333 | -0.315 |
| 28.7 | -0.252 |
| 28.716667 | -0.188 |
| 28.733333 | -0.13 |
| 28.75 | -0.083 |
| 28.766667 | -0.049 |
| 28.783333 | -0.024 |
| 28.8 | -0.013 |
| 28.816667 | -0.012 |
| 28.833333 | -0.014 |
| 28.85 | -0.015 |
| 28.866667 | -0.016 |
| 28.883333 | -0.016 |
| 28.9 | -0.015 |
| 28.916667 | -0.013 |
| 28.933333 | -0.013 |
| 28.95 | -0.013 |
| 28.966667 | -0.012 |
| 28.983333 | -0.011 |
| 29.0 | -0.01 |
| 29.016667 | -0.01 |
| 29.033333 | -0.009 |
| 29.05 | -0.008 |
| 29.066667 | -0.007 |
| 29.083333 | -0.006 |
| 29.1 | -0.005 |
| 29.116667 | -0.003 |
| 29.133333 | -0.003 |
| 29.15 | -0.002 |
| 29.166667 | -0.002 |
| 29.183333 | -0.001 |
| 29.2 | -0.001 |
| 29.216667 | -0.001 |
| 29.233333 | -0.001 |
| 29.25 | -0.001 |
| 29.266667 | 0 |
| 29.283333 | 0 |
| 29.3 | 0.001 |
| 29.316667 | 0.001 |
| 29.333333 | 0.001 |
| 29.35 | 0.001 |
| 29.366667 | 0.001 |
| 29.383333 | 0.001 |
| 29.4 | 0.001 |
| 29.416667 | 0.001 |
| 29.433333 | 0.001 |
| 29.45 | 0.001 |
| 29.466667 | 0.001 |
| 29.483333 | 0.001 |
| 29.5 | 0.001 |
| 29.516667 | 0.001 |
| 29.533333 | 0.001 |
| 29.55 | 0 |
| 29.566667 | 0 |
| 29.583333 | 0 |
| 29.6 | 0 |
| 29.616667 | 0 |
| 29.633333 | -0.001 |
| 29.65 | -0.001 |
| 29.666667 | -0.001 |
| 29.683333 | -0.001 |
| 29.7 | -0.001 |
| 29.716667 | -0.002 |
| 29.733333 | -0.002 |
| 29.75 | -0.002 |
| 29.766667 | -0.002 |
| 29.783333 | -0.002 |
| 29.8 | -0.003 |
| 29.816667 | -0.003 |
| 29.833333 | -0.003 |
| 29.85 | -0.003 |
| 29.866667 | -0.002 |
| 29.883333 | -0.002 |
| 29.9 | -0.002 |
| 29.916667 | -0.003 |
| 29.933333 | -0.003 |
| 29.95 | -0.003 |
| 29.966667 | -0.002 |
| 29.983333 | -0.002 |
| 30.0 | -0.002 |
| 30.016667 | -0.002 |
| 30.033333 | -0.001 |
| 30.05 | -0.001 |
| 30.066667 | -0.001 |
| 30.083333 | -0.001 |
| 30.1 | -0.001 |
| 30.116667 | -0.001 |
| 30.133333 | -0.001 |
| 30.15 | 0 |
| 30.166667 | 0 |
| 30.183333 | 0 |
| 30.2 | 0 |
| 30.216667 | 0.001 |
| 30.233333 | 0.001 |
| 30.25 | 0.002 |
| 30.266667 | 0.002 |
| 30.283333 | 0.002 |
| 30.3 | 0.002 |
| 30.316667 | 0.003 |
| 30.333333 | 0.003 |
| 30.35 | 0.003 |
| 30.366667 | 0.003 |
| 30.383333 | 0.003 |
| 30.4 | 0.003 |
| 30.416667 | 0.003 |
| 30.433333 | 0.003 |
| 30.45 | 0.002 |
| 30.466667 | 0.002 |
| 30.483333 | 0.002 |
| 30.5 | 0.002 |
| 30.516667 | 0.002 |
| 30.533333 | 0.002 |
| 30.55 | 0.001 |
| 30.566667 | 0.001 |
| 30.583333 | 0.001 |
| 30.6 | 0 |
| 30.616667 | 0 |
| 30.633333 | 0 |
| 30.65 | 0 |
| 30.666667 | -0.001 |
| 30.683333 | -0.001 |
| 30.7 | -0.001 |
| 30.716667 | -0.001 |
| 30.733333 | -0.001 |
| 30.75 | -0.001 |
| 30.766667 | -0.001 |
| 30.783333 | -0.001 |
| 30.8 | 0 |
| 30.816667 | 0 |
| 30.833333 | 0 |
| 30.85 | 0 |
| 30.866667 | 0 |
| 30.883333 | 0 |
| 30.9 | 0 |
| 30.916667 | 0.001 |
| 30.933333 | 0.001 |
| 30.95 | 0.001 |
| 30.966667 | 0.002 |
| 30.983333 | 0.002 |
| 31.0 | 0.002 |
| 31.016667 | 0.002 |
| 31.033333 | -0.001 |
| 31.05 | -0.003 |
| 31.066667 | -0.028 |
| 31.083333 | -0.089 |
| 31.1 | -0.18 |
| 31.116667 | -0.288 |
| 31.133333 | -0.366 |
| 31.15 | -0.394 |
| 31.166667 | -0.378 |
| 31.183333 | -0.333 |
| 31.2 | -0.267 |
| 31.216667 | -0.2 |
| 31.233333 | -0.141 |
| 31.25 | -0.091 |
| 31.266667 | -0.055 |
| 31.283333 | -0.03 |
| 31.3 | -0.017 |
| 31.316667 | -0.015 |
| 31.333333 | -0.017 |
| 31.35 | -0.018 |
| 31.366667 | -0.019 |
| 31.383333 | -0.019 |
| 31.4 | -0.018 |
| 31.416667 | -0.017 |
| 31.433333 | -0.017 |
| 31.45 | -0.016 |
| 31.466667 | -0.016 |
| 31.483333 | -0.015 |
| 31.5 | -0.015 |
| 31.516667 | -0.014 |
| 31.533333 | -0.013 |
| 31.55 | -0.013 |
| 31.566667 | -0.012 |
| 31.583333 | -0.011 |
| 31.6 | -0.01 |
| 31.616667 | -0.009 |
| 31.633333 | -0.008 |
| 31.65 | -0.007 |
| 31.666667 | -0.006 |
| 31.683333 | -0.006 |
| 31.7 | -0.005 |
| 31.716667 | -0.004 |
| 31.733333 | -0.004 |
| 31.75 | -0.003 |
| 31.766667 | -0.002 |
| 31.783333 | -0.002 |
| 31.8 | -0.002 |
| 31.816667 | -0.001 |
| 31.833333 | -0.001 |
| 31.85 | -0.001 |
| 31.866667 | -0.001 |
| 31.883333 | 0 |
| 31.9 | 0 |
| 31.916667 | 0 |
| 31.933333 | 0 |
| 31.95 | 0 |
| 31.966667 | 0 |
| 31.983333 | 0 |
| 32.0 | -0.001 |
| 32.016667 | -0.001 |
| 32.033333 | -0.001 |
| 32.05 | -0.001 |
| 32.066667 | -0.001 |
| 32.083333 | -0.001 |
| 32.1 | -0.001 |
| 32.116667 | -0.001 |
| 32.133333 | -0.001 |
| 32.15 | 0 |
| 32.166667 | 0 |
| 32.183333 | 0 |
| 32.2 | 0 |
| 32.216667 | 0 |
| 32.233333 | 0 |
| 32.25 | -0.001 |
| 32.266667 | -0.001 |
| 32.283333 | -0.001 |
| 32.3 | 0 |
| 32.316667 | 0 |
| 32.333333 | 0 |
| 32.35 | 0 |
| 32.366667 | 0 |
| 32.383333 | 0 |
| 32.4 | 0 |
| 32.416667 | 0 |
| 32.433333 | 0 |
| 32.45 | 0 |
| 32.466667 | 0 |
| 32.483333 | 0 |
| 32.5 | 0 |
| 32.516667 | 0 |
| 32.533333 | 0.001 |
| 32.55 | 0.001 |
| 32.566667 | 0.001 |
| 32.583333 | 0.001 |
| 32.6 | 0.001 |
| 32.616667 | 0.001 |
| 32.633333 | 0.001 |
| 32.65 | 0.001 |
| 32.666667 | 0.001 |
| 32.683333 | 0.001 |
| 32.7 | 0.002 |
| 32.716667 | 0.002 |
| 32.733333 | 0.002 |
| 32.75 | 0.002 |
| 32.766667 | 0.001 |
| 32.783333 | 0.001 |
| 32.8 | 0.001 |
| 32.816667 | 0 |
| 32.833333 | 0 |
| 32.85 | 0 |
| 32.866667 | 0 |
| 32.883333 | 0 |
| 32.9 | 0 |
| 32.916667 | -0.001 |
| 32.933333 | -0.001 |
| 32.95 | -0.001 |
| 32.966667 | -0.001 |
| 32.983333 | -0.001 |
| 33.0 | -0.002 |
| 33.016667 | -0.002 |
| 33.033333 | -0.002 |
| 33.05 | -0.002 |
| 33.066667 | -0.002 |
| 33.083333 | -0.002 |
| 33.1 | -0.002 |
| 33.116667 | -0.002 |
| 33.133333 | -0.002 |
| 33.15 | -0.001 |
| 33.166667 | -0.001 |
| 33.183333 | 0 |
| 33.2 | 0 |
| 33.216667 | 0.001 |
| 33.233333 | 0.001 |
| 33.25 | 0.002 |
| 33.266667 | 0.003 |
| 33.283333 | 0.004 |
| 33.3 | 0.003 |
| 33.316667 | 0.002 |
| 33.333333 | 0.001 |
| 33.35 | 0.001 |
| 33.366667 | 0.001 |
| 33.383333 | -0.001 |
| 33.4 | -0.001 |
| 33.416667 | 0.001 |
| 33.433333 | 0.001 |
| 33.45 | 0.001 |
| 33.466667 | 0.001 |
| 33.483333 | 0.004 |
| 33.5 | 0.006 |
| 33.516667 | 0.007 |
| 33.533333 | 0.007 |
| 33.55 | 0.003 |
| 33.566667 | -0.031 |
| 33.583333 | -0.093 |
| 33.6 | -0.183 |
| 33.616667 | -0.286 |
| 33.633333 | -0.358 |
| 33.65 | -0.386 |
| 33.666667 | -0.369 |
| 33.683333 | -0.32 |
| 33.7 | -0.257 |
| 33.716667 | -0.189 |
| 33.733333 | -0.133 |
| 33.75 | -0.087 |
| 33.766667 | -0.053 |
| 33.783333 | -0.033 |
| 33.8 | -0.021 |
| 33.816667 | -0.016 |
| 33.833333 | -0.016 |
| 33.85 | -0.017 |
| 33.866667 | -0.017 |
| 33.883333 | -0.017 |
| 33.9 | -0.016 |
| 33.916667 | -0.014 |
| 33.933333 | -0.014 |
| 33.95 | -0.014 |
| 33.966667 | -0.013 |
| 33.983333 | -0.012 |
| 34.0 | -0.011 |
| 34.016667 | -0.011 |
| 34.033333 | -0.01 |
| 34.05 | -0.01 |
| 34.066667 | -0.009 |
| 34.083333 | -0.009 |
| 34.1 | -0.008 |
| 34.116667 | -0.007 |
| 34.133333 | -0.007 |
| 34.15 | -0.006 |
| 34.166667 | -0.006 |
| 34.183333 | -0.006 |
| 34.2 | -0.006 |
| 34.216667 | -0.005 |
| 34.233333 | -0.005 |
| 34.25 | -0.004 |
| 34.266667 | -0.004 |
| 34.283333 | -0.003 |
| 34.3 | -0.003 |
| 34.316667 | -0.003 |
| 34.333333 | -0.002 |
| 34.35 | -0.002 |
| 34.366667 | -0.001 |
| 34.383333 | -0.001 |
| 34.4 | -0.001 |
| 34.416667 | -0.001 |
| 34.433333 | 0 |
| 34.45 | 0 |
| 34.466667 | 0 |
| 34.483333 | 0 |
| 34.5 | 0.001 |
| 34.516667 | 0.001 |
| 34.533333 | 0.001 |
| 34.55 | 0.001 |
| 34.566667 | 0.001 |
| 34.583333 | 0.001 |
| 34.6 | 0.001 |
| 34.616667 | 0.001 |
| 34.633333 | 0.001 |
| 34.65 | 0.001 |
| 34.666667 | 0.001 |
| 34.683333 | 0 |
| 34.7 | 0.001 |
| 34.716667 | 0.001 |
| 34.733333 | 0.001 |
| 34.75 | 0.001 |
| 34.766667 | 0.001 |
| 34.783333 | 0.001 |
| 34.8 | 0 |
| 34.816667 | 0 |
| 34.833333 | 0 |
| 34.85 | 0 |
| 34.866667 | 0 |
| 34.883333 | 0 |
| 34.9 | 0 |
| 34.916667 | 0 |
| 34.933333 | -0.001 |
| 34.95 | 0 |
| 34.966667 | -0.001 |
| 34.983333 | -0.001 |
| 35.0 | -0.001 |
| 35.016667 | -0.001 |
| 35.033333 | -0.001 |
| 35.05 | -0.001 |
| 35.066667 | -0.001 |
| 35.083333 | -0.001 |
| 35.1 | -0.001 |
| 35.116667 | -0.001 |
| 35.133333 | -0.001 |
| 35.15 | -0.001 |
| 35.166667 | 0 |
| 35.183333 | 0 |
| 35.2 | 0 |
| 35.216667 | -0.001 |
| 35.233333 | 0 |
| 35.25 | 0 |
| 35.266667 | 0 |
| 35.283333 | 0 |
| 35.3 | 0 |
| 35.316667 | 0 |
| 35.333333 | 0 |
| 35.35 | 0 |
| 35.366667 | 0 |
| 35.383333 | 0 |
| 35.4 | 0 |
| 35.416667 | 0.001 |
| 35.433333 | 0.001 |
| 35.45 | 0.001 |
| 35.466667 | 0.002 |
| 35.483333 | 0.002 |
| 35.5 | 0.002 |
| 35.516667 | 0.002 |
| 35.533333 | 0.001 |
| 35.55 | 0.001 |
| 35.566667 | 0.001 |
| 35.583333 | 0.001 |
| 35.6 | 0.001 |
| 35.616667 | 0.001 |
| 35.633333 | 0.001 |
| 35.65 | 0.001 |
| 35.666667 | 0.001 |
| 35.683333 | 0 |
| 35.7 | 0 |
| 35.716667 | 0 |
| 35.733333 | 0 |
| 35.75 | 0 |
| 35.766667 | 0 |
| 35.783333 | 0 |
| 35.8 | -0.001 |
| 35.816667 | -0.001 |
| 35.833333 | -0.001 |
| 35.85 | -0.001 |
| 35.866667 | 0 |
| 35.883333 | 0 |
| 35.9 | 0 |
| 35.916667 | 0 |
| 35.933333 | 0.001 |
| 35.95 | 0.001 |
| 35.966667 | 0.001 |
| 35.983333 | 0.001 |
| 36.0 | 0.001 |
| 36.016667 | 0.002 |
| 36.033333 | 0.002 |
| 36.05 | 0.004 |
| 36.066667 | -0.019 |
| 36.083333 | -0.072 |
| 36.1 | -0.154 |
| 36.116667 | -0.26 |
| 36.133333 | -0.342 |
| 36.15 | -0.378 |
| 36.166667 | -0.372 |
| 36.183333 | -0.333 |
| 36.2 | -0.273 |
| 36.216667 | -0.208 |
| 36.233333 | -0.147 |
| 36.25 | -0.098 |
| 36.266667 | -0.06 |
| 36.283333 | -0.033 |
| 36.3 | -0.016 |
| 36.316667 | -0.011 |
| 36.333333 | -0.012 |
| 36.35 | -0.014 |
| 36.366667 | -0.016 |
| 36.383333 | -0.016 |
| 36.4 | -0.016 |
| 36.416667 | -0.015 |
| 36.433333 | -0.015 |
| 36.45 | -0.014 |
| 36.466667 | -0.013 |
| 36.483333 | -0.012 |
| 36.5 | -0.012 |
| 36.516667 | -0.011 |
| 36.533333 | -0.011 |
| 36.55 | -0.01 |
| 36.566667 | -0.009 |
| 36.583333 | -0.008 |
| 36.6 | -0.007 |
| 36.616667 | -0.007 |
| 36.633333 | -0.006 |
| 36.65 | -0.005 |
| 36.666667 | -0.005 |
| 36.683333 | -0.005 |
| 36.7 | -0.005 |
| 36.716667 | -0.004 |
| 36.733333 | -0.004 |
| 36.75 | -0.004 |
| 36.766667 | -0.004 |
| 36.783333 | -0.004 |
| 36.8 | -0.003 |
| 36.816667 | -0.003 |
| 36.833333 | -0.003 |
| 36.85 | -0.003 |
| 36.866667 | -0.003 |
| 36.883333 | -0.002 |
| 36.9 | -0.002 |
| 36.916667 | -0.001 |
| 36.933333 | -0.001 |
| 36.95 | -0.001 |
| 36.966667 | -0.001 |
| 36.983333 | -0.001 |
| 37.0 | 0 |
| 37.016667 | 0.001 |
| 37.033333 | 0 |
| 37.05 | 0 |
| 37.066667 | 0.001 |
| 37.083333 | 0.001 |
| 37.1 | 0 |
| 37.116667 | 0 |
| 37.133333 | 0 |
| 37.15 | 0 |
| 37.166667 | 0.001 |
| 37.183333 | 0.001 |
| 37.2 | 0 |
| 37.216667 | 0 |
| 37.233333 | 0.001 |
| 37.25 | 0.001 |
| 37.266667 | 0 |
| 37.283333 | 0.001 |
| 37.3 | 0.001 |
| 37.316667 | 0.001 |
| 37.333333 | 0.001 |
| 37.35 | 0.001 |
| 37.366667 | 0.002 |
| 37.383333 | 0.002 |
| 37.4 | 0.002 |
| 37.416667 | 0.002 |
| 37.433333 | 0.002 |
| 37.45 | 0.001 |
| 37.466667 | 0.001 |
| 37.483333 | 0.001 |
| 37.5 | 0.001 |
| 37.516667 | 0.002 |
| 37.533333 | 0.001 |
| 37.55 | 0.001 |
| 37.566667 | 0.001 |
| 37.583333 | 0.001 |
| 37.6 | 0.001 |
| 37.616667 | 0.001 |
| 37.633333 | 0 |
| 37.65 | 0 |
| 37.666667 | 0 |
| 37.683333 | -0.001 |
| 37.7 | -0.002 |
| 37.716667 | -0.001 |
| 37.733333 | -0.002 |
| 37.75 | -0.002 |
| 37.766667 | -0.001 |
| 37.783333 | -0.001 |
| 37.8 | -0.001 |
| 37.816667 | -0.001 |
| 37.833333 | -0.001 |
| 37.85 | -0.002 |
| 37.866667 | -0.002 |
| 37.883333 | -0.001 |
| 37.9 | -0.001 |
| 37.916667 | -0.001 |
| 37.933333 | -0.001 |
| 37.95 | -0.001 |
| 37.966667 | 0 |
| 37.983333 | -0.001 |
| 38.0 | -0.001 |
| 38.016667 | -0.001 |
| 38.033333 | 0 |
| 38.05 | 0 |
| 38.066667 | 0 |
| 38.083333 | 0 |
| 38.1 | 0 |
| 38.116667 | 0 |
| 38.133333 | 0 |
| 38.15 | 0 |
| 38.166667 | 0 |
| 38.183333 | 0 |
| 38.2 | 0.001 |
| 38.216667 | 0.001 |
| 38.233333 | 0.001 |
| 38.25 | 0.001 |
| 38.266667 | 0.001 |
| 38.283333 | 0.001 |
| 38.3 | 0.001 |
| 38.316667 | 0.001 |
| 38.333333 | 0.001 |
| 38.35 | 0.002 |
| 38.366667 | 0.002 |
| 38.383333 | 0.002 |
| 38.4 | 0.002 |
| 38.416667 | 0.002 |
| 38.433333 | 0.002 |
| 38.45 | 0.002 |
| 38.466667 | 0.003 |
| 38.483333 | 0.003 |
| 38.5 | 0.004 |
| 38.516667 | 0.003 |
| 38.533333 | -0.002 |
| 38.55 | -0.001 |
| 38.566667 | -0.019 |
| 38.583333 | -0.076 |
| 38.6 | -0.157 |
| 38.616667 | -0.262 |
| 38.633333 | -0.339 |
| 38.65 | -0.375 |
| 38.666667 | -0.365 |
| 38.683333 | -0.324 |
| 38.7 | -0.263 |
| 38.716667 | -0.201 |
| 38.733333 | -0.143 |
| 38.75 | -0.092 |
| 38.766667 | -0.057 |
| 38.783333 | -0.034 |
| 38.8 | -0.02 |
| 38.816667 | -0.017 |
| 38.833333 | -0.016 |
| 38.85 | -0.018 |
| 38.866667 | -0.017 |
| 38.883333 | -0.017 |
| 38.9 | -0.016 |
| 38.916667 | -0.015 |
| 38.933333 | -0.014 |
| 38.95 | -0.013 |
| 38.966667 | -0.012 |
| 38.983333 | -0.011 |
| 39.0 | -0.011 |
| 39.016667 | -0.01 |
| 39.033333 | -0.009 |
| 39.05 | -0.009 |
| 39.066667 | -0.008 |
| 39.083333 | -0.008 |
| 39.1 | -0.007 |
| 39.116667 | -0.006 |
| 39.133333 | -0.006 |
| 39.15 | -0.005 |
| 39.166667 | -0.005 |
| 39.183333 | -0.005 |
| 39.2 | -0.004 |
| 39.216667 | -0.004 |
| 39.233333 | -0.004 |
| 39.25 | -0.004 |
| 39.266667 | -0.004 |
| 39.283333 | -0.004 |
| 39.3 | -0.004 |
| 39.316667 | -0.003 |
| 39.333333 | -0.003 |
| 39.35 | -0.003 |
| 39.366667 | -0.003 |
| 39.383333 | -0.003 |
| 39.4 | -0.003 |
| 39.416667 | -0.002 |
| 39.433333 | -0.002 |
| 39.45 | -0.002 |
| 39.466667 | -0.002 |
| 39.483333 | -0.002 |
| 39.5 | -0.001 |
| 39.516667 | -0.001 |
| 39.533333 | -0.001 |
| 39.55 | -0.001 |
| 39.566667 | 0 |
| 39.583333 | -0.001 |
| 39.6 | -0.001 |
| 39.616667 | -0.001 |
| 39.633333 | -0.001 |
| 39.65 | 0 |
| 39.666667 | 0 |
| 39.683333 | 0 |
| 39.7 | 0 |
| 39.716667 | 0 |
| 39.733333 | 0 |
| 39.75 | 0 |
| 39.766667 | 0 |
| 39.783333 | 0 |
| 39.8 | 0 |
| 39.816667 | 0.001 |
| 39.833333 | 0 |
| 39.85 | 0 |
| 39.866667 | 0.001 |
| 39.883333 | 0.001 |
| 39.9 | 0.001 |
| 39.916667 | 0.001 |
| 39.933333 | 0.001 |
| 39.95 | 0.001 |
| 39.966667 | 0.001 |
| 39.983333 | 0.001 |
| 40.0 | 0.001 |
| 40.016667 | 0.001 |
| 40.033333 | 0.001 |
| 40.05 | 0.001 |
| 40.066667 | 0.002 |
| 40.083333 | 0.002 |
| 40.1 | 0.002 |
| 40.116667 | 0.002 |
| 40.133333 | 0.002 |
| 40.15 | 0.002 |
| 40.166667 | 0.002 |
| 40.183333 | 0.002 |
| 40.2 | 0.002 |
| 40.216667 | 0.002 |
| 40.233333 | 0.002 |
| 40.25 | 0.002 |
| 40.266667 | 0.002 |
| 40.283333 | 0.002 |
| 40.3 | 0.002 |
| 40.316667 | 0.002 |
| 40.333333 | 0.001 |
| 40.35 | 0.001 |
| 40.366667 | 0.001 |
| 40.383333 | 0.001 |
| 40.4 | 0.001 |
| 40.416667 | 0.001 |
| 40.433333 | 0.001 |
| 40.45 | 0 |
| 40.466667 | 0 |
| 40.483333 | 0 |
| 40.5 | 0 |
| 40.516667 | -0.001 |
| 40.533333 | -0.001 |
| 40.55 | -0.001 |
| 40.566667 | -0.001 |
| 40.583333 | -0.001 |
| 40.6 | -0.002 |
| 40.616667 | -0.002 |
| 40.633333 | -0.001 |
| 40.65 | -0.001 |
| 40.666667 | -0.001 |
| 40.683333 | -0.001 |
| 40.7 | -0.001 |
| 40.716667 | -0.001 |
| 40.733333 | -0.001 |
| 40.75 | -0.001 |
| 40.766667 | -0.001 |
| 40.783333 | -0.001 |
| 40.8 | -0.001 |
| 40.816667 | -0.001 |
| 40.833333 | -0.001 |
| 40.85 | -0.001 |
| 40.866667 | 0 |
| 40.883333 | 0 |
| 40.9 | 0 |
| 40.916667 | 0 |
| 40.933333 | 0 |
| 40.95 | 0.001 |
| 40.966667 | 0.001 |
| 40.983333 | 0.001 |
| 41.0 | 0.001 |
| 41.016667 | 0 |
| 41.033333 | -0.002 |
| 41.05 | -0.002 |
| 41.066667 | -0.012 |
| 41.083333 | -0.06 |
| 41.1 | -0.137 |
| 41.116667 | -0.237 |
| 41.133333 | -0.324 |
| 41.15 | -0.37 |
| 41.166667 | -0.377 |
| 41.183333 | -0.335 |
| 41.2 | -0.273 |
| 41.216667 | -0.211 |
| 41.233333 | -0.155 |
| 41.25 | -0.101 |
| 41.266667 | -0.06 |
| 41.283333 | -0.033 |
| 41.3 | -0.019 |
| 41.316667 | -0.012 |
| 41.333333 | -0.014 |
| 41.35 | -0.017 |
| 41.366667 | -0.018 |
| 41.383333 | -0.018 |
| 41.4 | -0.017 |
| 41.416667 | -0.017 |
| 41.433333 | -0.016 |
| 41.45 | -0.016 |
| 41.466667 | -0.016 |
| 41.483333 | -0.016 |
| 41.5 | -0.015 |
| 41.516667 | -0.014 |
| 41.533333 | -0.013 |
| 41.55 | -0.013 |
| 41.566667 | -0.012 |
| 41.583333 | -0.011 |
| 41.6 | -0.01 |
| 41.616667 | -0.01 |
| 41.633333 | -0.009 |
| 41.65 | -0.008 |
| 41.666667 | -0.008 |
| 41.683333 | -0.007 |
| 41.7 | -0.007 |
| 41.716667 | -0.006 |
| 41.733333 | -0.005 |
| 41.75 | -0.005 |
| 41.766667 | -0.004 |
| 41.783333 | -0.004 |
| 41.8 | -0.004 |
| 41.816667 | -0.003 |
| 41.833333 | -0.003 |
| 41.85 | -0.002 |
| 41.866667 | -0.002 |
| 41.883333 | -0.001 |
| 41.9 | -0.001 |
| 41.916667 | -0.001 |
| 41.933333 | 0 |
| 41.95 | 0 |
| 41.966667 | 0 |
| 41.983333 | 0.001 |
| 42.0 | 0.001 |
| 42.016667 | 0.001 |
| 42.033333 | 0.001 |
| 42.05 | 0.001 |
| 42.066667 | 0.001 |
| 42.083333 | 0.001 |
| 42.1 | 0.001 |
| 42.116667 | 0.001 |
| 42.133333 | 0.001 |
| 42.15 | 0 |
| 42.166667 | 0 |
| 42.183333 | 0 |
| 42.2 | 0 |
| 42.216667 | -0.001 |
| 42.233333 | 0 |
| 42.25 | 0 |
| 42.266667 | 0 |
| 42.283333 | 0 |
| 42.3 | 0 |
| 42.316667 | 0 |
| 42.333333 | -0.001 |
| 42.35 | -0.001 |
| 42.366667 | -0.001 |
| 42.383333 | -0.001 |
| 42.4 | -0.001 |
| 42.416667 | -0.001 |
| 42.433333 | -0.001 |
| 42.45 | 0 |
| 42.466667 | 0 |
| 42.483333 | 0 |
| 42.5 | 0 |
| 42.516667 | 0 |
| 42.533333 | 0 |
| 42.55 | 0 |
| 42.566667 | 0 |
| 42.583333 | 0 |
| 42.6 | 0 |
| 42.616667 | 0 |
| 42.633333 | 0 |
| 42.65 | 0 |
| 42.666667 | 0 |
| 42.683333 | 0 |
| 42.7 | 0.001 |
| 42.716667 | 0.001 |
| 42.733333 | 0.001 |
| 42.75 | 0.001 |
| 42.766667 | 0 |
| 42.783333 | 0.001 |
| 42.8 | 0.001 |
| 42.816667 | 0 |
| 42.833333 | 0.001 |
| 42.85 | 0.001 |
| 42.866667 | 0.002 |
| 42.883333 | 0.003 |
| 42.9 | 0.003 |
| 42.916667 | 0.003 |
| 42.933333 | 0.003 |
| 42.95 | 0.003 |
| 42.966667 | 0.002 |
| 42.983333 | 0.002 |
| 43.0 | 0.001 |
| 43.016667 | 0.001 |
| 43.033333 | 0.002 |
| 43.05 | 0.002 |
| 43.066667 | 0.002 |
| 43.083333 | 0.001 |
| 43.1 | 0.001 |
| 43.116667 | 0 |
| 43.133333 | 0 |
| 43.15 | 0 |
| 43.166667 | 0 |
| 43.183333 | -0.001 |
| 43.2 | -0.001 |
| 43.216667 | -0.001 |
| 43.233333 | -0.001 |
| 43.25 | -0.001 |
| 43.266667 | -0.001 |
| 43.283333 | -0.001 |
| 43.3 | -0.001 |
| 43.316667 | -0.001 |
| 43.333333 | -0.001 |
| 43.35 | -0.001 |
| 43.366667 | -0.001 |
| 43.383333 | 0 |
| 43.4 | 0 |
| 43.416667 | 0 |
| 43.433333 | 0 |
| 43.45 | 0 |
| 43.466667 | 0.001 |
| 43.483333 | 0 |
| 43.5 | 0 |
| 43.516667 | 0.002 |
| 43.533333 | 0.003 |
| 43.55 | 0.001 |
| 43.566667 | -0.003 |
| 43.583333 | -0.044 |
| 43.6 | -0.118 |
| 43.616667 | -0.213 |
| 43.633333 | -0.306 |
| 43.65 | -0.359 |
| 43.666667 | -0.369 |
| 43.683333 | -0.337 |
| 43.7 | -0.281 |
| 43.716667 | -0.221 |
| 43.733333 | -0.158 |
| 43.75 | -0.104 |
| 43.766667 | -0.064 |
| 43.783333 | -0.035 |
| 43.8 | -0.018 |
| 43.816667 | -0.007 |
| 43.833333 | -0.007 |
| 43.85 | -0.009 |
| 43.866667 | -0.011 |
| 43.883333 | -0.011 |
| 43.9 | -0.012 |
| 43.916667 | -0.011 |
| 43.933333 | -0.011 |
| 43.95 | -0.01 |
| 43.966667 | -0.01 |
| 43.983333 | -0.01 |
| 44.0 | -0.009 |
| 44.016667 | -0.009 |
| 44.033333 | -0.008 |
| 44.05 | -0.007 |
| 44.066667 | -0.007 |
| 44.083333 | -0.006 |
| 44.1 | -0.005 |
| 44.116667 | -0.005 |
| 44.133333 | -0.004 |
| 44.15 | -0.003 |
| 44.166667 | -0.002 |
| 44.183333 | -0.002 |
| 44.2 | -0.002 |
| 44.216667 | -0.001 |
| 44.233333 | -0.001 |
| 44.25 | -0.001 |
| 44.266667 | -0.001 |
| 44.283333 | -0.001 |
| 44.3 | -0.001 |
| 44.316667 | -0.001 |
| 44.333333 | -0.001 |
| 44.35 | -0.001 |
| 44.366667 | -0.001 |
| 44.383333 | -0.001 |
| 44.4 | -0.001 |
| 44.416667 | -0.001 |
| 44.433333 | -0.001 |
| 44.45 | -0.001 |
| 44.466667 | -0.001 |
| 44.483333 | -0.001 |
| 44.5 | -0.001 |
| 44.516667 | -0.001 |
| 44.533333 | -0.001 |
| 44.55 | -0.001 |
| 44.566667 | -0.001 |
| 44.583333 | -0.001 |
| 44.6 | -0.001 |
| 44.616667 | 0 |
| 44.633333 | 0 |
| 44.65 | 0 |
| 44.666667 | 0 |
| 44.683333 | 0 |
| 44.7 | 0 |
| 44.716667 | -0.001 |
| 44.733333 | -0.001 |
| 44.75 | -0.001 |
| 44.766667 | -0.001 |
| 44.783333 | 0 |
| 44.8 | 0 |
| 44.816667 | 0 |
| 44.833333 | 0 |
| 44.85 | -0.001 |
| 44.866667 | -0.001 |
| 44.883333 | -0.001 |
| 44.9 | -0.001 |
| 44.916667 | 0 |
| 44.933333 | 0 |
| 44.95 | 0 |
| 44.966667 | 0 |
| 44.983333 | 0 |
| 45.0 | 0 |
| 45.016667 | 0 |
| 45.033333 | 0 |
| 45.05 | 0 |
| 45.066667 | 0 |
| 45.083333 | 0 |
| 45.1 | 0 |
| 45.116667 | 0 |
| 45.133333 | -0.001 |
| 45.15 | 0 |
| 45.166667 | 0 |
| 45.183333 | 0 |
| 45.2 | 0 |
| 45.216667 | 0 |
| 45.233333 | 0 |
| 45.25 | 0 |
| 45.266667 | 0.001 |
| 45.283333 | 0.001 |
| 45.3 | 0.001 |
| 45.316667 | 0.001 |
| 45.333333 | 0.001 |
| 45.35 | 0.001 |
| 45.366667 | 0 |
| 45.383333 | 0.001 |
| 45.4 | 0.001 |
| 45.416667 | 0.001 |
| 45.433333 | 0.001 |
| 45.45 | 0.001 |
| 45.466667 | 0.001 |
| 45.483333 | 0.001 |
| 45.5 | 0.001 |
| 45.516667 | 0.001 |
| 45.533333 | 0.001 |
| 45.55 | 0.001 |
| 45.566667 | 0.001 |
| 45.583333 | 0.001 |
| 45.6 | 0 |
| 45.616667 | 0 |
| 45.633333 | 0 |
| 45.65 | 0 |
| 45.666667 | 0.001 |
| 45.683333 | 0.001 |
| 45.7 | 0.001 |
| 45.716667 | 0.001 |
| 45.733333 | 0.001 |
| 45.75 | 0.001 |
| 45.766667 | 0.001 |
| 45.783333 | 0.001 |
| 45.8 | 0.001 |
| 45.816667 | 0.001 |
| 45.833333 | 0.001 |
| 45.85 | 0.001 |
| 45.866667 | 0.001 |
| 45.883333 | 0.001 |
| 45.9 | 0.001 |
| 45.916667 | 0.001 |
| 45.933333 | 0.001 |
| 45.95 | 0 |
| 45.966667 | 0 |
| 45.983333 | 0 |
| 46.0 | -0.001 |
| 46.016667 | 0.001 |
| 46.033333 | 0.003 |
| 46.05 | 0.002 |
| 46.066667 | 0.003 |
| 46.083333 | -0.037 |
| 46.1 | -0.101 |
| 46.116667 | -0.193 |
| 46.133333 | -0.293 |
| 46.15 | -0.355 |
| 46.166667 | -0.372 |
| 46.183333 | -0.346 |
| 46.2 | -0.292 |
| 46.216667 | -0.233 |
| 46.233333 | -0.171 |
| 46.25 | -0.114 |
| 46.266667 | -0.068 |
| 46.283333 | -0.039 |
| 46.3 | -0.025 |
| 46.316667 | -0.013 |
| 46.333333 | -0.011 |
| 46.35 | -0.012 |
| 46.366667 | -0.012 |
| 46.383333 | -0.013 |
| 46.4 | -0.014 |
| 46.416667 | -0.014 |
| 46.433333 | -0.014 |
| 46.45 | -0.013 |
| 46.466667 | -0.013 |
| 46.483333 | -0.012 |
| 46.5 | -0.012 |
| 46.516667 | -0.011 |
| 46.533333 | -0.011 |
| 46.55 | -0.01 |
| 46.566667 | -0.01 |
| 46.583333 | -0.009 |
| 46.6 | -0.009 |
| 46.616667 | -0.008 |
| 46.633333 | -0.007 |
| 46.65 | -0.007 |
| 46.666667 | -0.006 |
| 46.683333 | -0.006 |
| 46.7 | -0.005 |
| 46.716667 | -0.005 |
| 46.733333 | -0.004 |
| 46.75 | -0.004 |
| 46.766667 | -0.004 |
| 46.783333 | -0.003 |
| 46.8 | -0.003 |
| 46.816667 | -0.003 |
| 46.833333 | -0.003 |
| 46.85 | -0.003 |
| 46.866667 | -0.003 |
| 46.883333 | -0.003 |
| 46.9 | -0.003 |
| 46.916667 | -0.002 |
| 46.933333 | -0.002 |
| 46.95 | -0.002 |
| 46.966667 | -0.002 |
| 46.983333 | -0.002 |
| 47.0 | -0.002 |
| 47.016667 | -0.001 |
| 47.033333 | -0.001 |
| 47.05 | -0.001 |
| 47.066667 | -0.001 |
| 47.083333 | -0.001 |
| 47.1 | -0.001 |
| 47.116667 | 0 |
| 47.133333 | 0 |
| 47.15 | 0 |
| 47.166667 | 0 |
| 47.183333 | 0 |
| 47.2 | 0.001 |
| 47.216667 | 0.001 |
| 47.233333 | 0.001 |
| 47.25 | 0.001 |
| 47.266667 | 0.001 |
| 47.283333 | 0.001 |
| 47.3 | 0.002 |
| 47.316667 | 0.002 |
| 47.333333 | 0.002 |
| 47.35 | 0.002 |
| 47.366667 | 0.002 |
| 47.383333 | 0.002 |
| 47.4 | 0.002 |
| 47.416667 | 0.002 |
| 47.433333 | 0.001 |
| 47.45 | 0.001 |
| 47.466667 | 0.001 |
| 47.483333 | 0.001 |
| 47.5 | 0.001 |
| 47.516667 | 0.001 |
| 47.533333 | 0.001 |
| 47.55 | 0.001 |
| 47.566667 | 0.001 |
| 47.583333 | 0.001 |
| 47.6 | 0.001 |
| 47.616667 | 0 |
| 47.633333 | 0 |
| 47.65 | 0 |
| 47.666667 | 0 |
| 47.683333 | -0.001 |
| 47.7 | -0.001 |
| 47.716667 | 0 |
| 47.733333 | 0 |
| 47.75 | 0 |
| 47.766667 | 0 |
| 47.783333 | 0 |
| 47.8 | 0 |
| 47.816667 | 0 |
| 47.833333 | 0 |
| 47.85 | 0 |
| 47.866667 | 0 |
| 47.883333 | 0 |
| 47.9 | 0 |
| 47.916667 | 0 |
| 47.933333 | 0.001 |
| 47.95 | 0.001 |
| 47.966667 | 0.001 |
| 47.983333 | 0.001 |
| 48.0 | 0.001 |
| 48.016667 | 0 |
| 48.033333 | 0 |
| 48.05 | 0 |
| 48.066667 | -0.001 |
| 48.083333 | -0.001 |
| 48.1 | -0.001 |
| 48.116667 | -0.001 |
| 48.133333 | -0.001 |
| 48.15 | -0.001 |
| 48.166667 | -0.001 |
| 48.183333 | -0.001 |
| 48.2 | -0.001 |
| 48.216667 | -0.001 |
| 48.233333 | -0.001 |
| 48.25 | -0.001 |
| 48.266667 | -0.001 |
| 48.283333 | -0.001 |
| 48.3 | -0.001 |
| 48.316667 | -0.001 |
| 48.333333 | 0 |
| 48.35 | 0 |
| 48.366667 | 0 |
| 48.383333 | 0 |
| 48.4 | 0 |
| 48.416667 | 0 |
| 48.433333 | 0 |
| 48.45 | 0 |
| 48.466667 | 0 |
| 48.483333 | 0.001 |
| 48.5 | 0.001 |
| 48.516667 | 0.001 |
| 48.533333 | 0.001 |